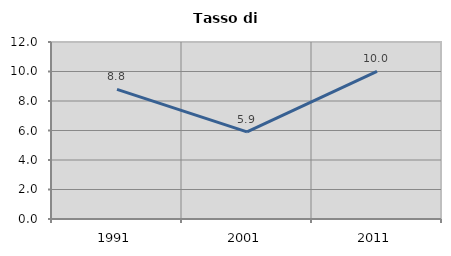
| Category | Tasso di disoccupazione   |
|---|---|
| 1991.0 | 8.791 |
| 2001.0 | 5.906 |
| 2011.0 | 10.012 |